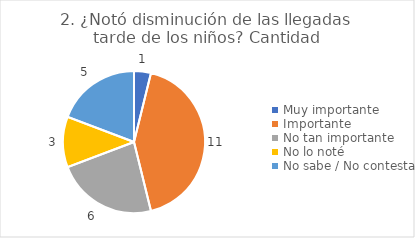
| Category | 2. ¿Notó disminución de las llegadas tarde de los niños? |
|---|---|
| Muy importante  | 0.038 |
| Importante  | 0.423 |
| No tan importante  | 0.231 |
| No lo noté  | 0.115 |
| No sabe / No contesta | 0.192 |